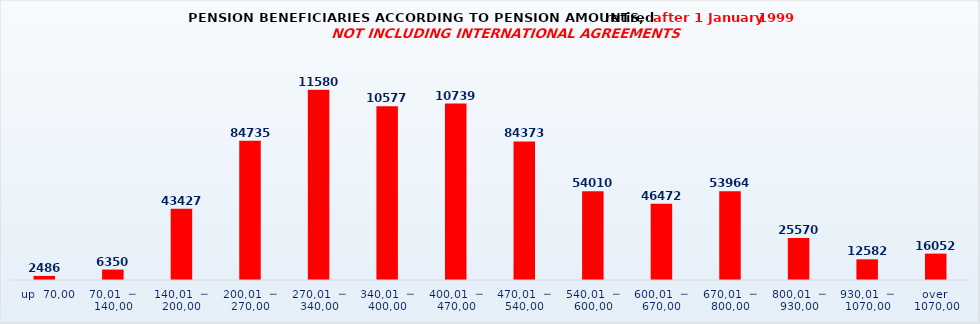
| Category | Series 0 |
|---|---|
|   up  70,00 | 2486 |
| 70,01  ─  140,00 | 6350 |
| 140,01  ─  200,00 | 43427 |
| 200,01  ─  270,00 | 84735 |
| 270,01  ─  340,00 | 115805 |
| 340,01  ─  400,00 | 105770 |
| 400,01  ─  470,00 | 107394 |
| 470,01  ─  540,00 | 84373 |
| 540,01  ─  600,00 | 54010 |
| 600,01  ─  670,00 | 46472 |
| 670,01  ─  800,00 | 53964 |
| 800,01  ─  930,00 | 25570 |
| 930,01  ─  1070,00 | 12582 |
| over  1070,00 | 16052 |